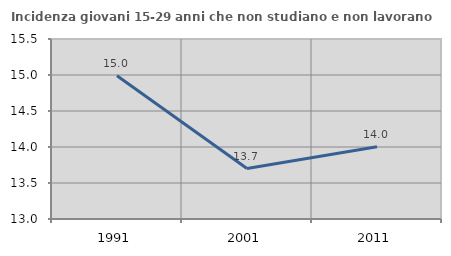
| Category | Incidenza giovani 15-29 anni che non studiano e non lavorano  |
|---|---|
| 1991.0 | 14.991 |
| 2001.0 | 13.701 |
| 2011.0 | 14.003 |